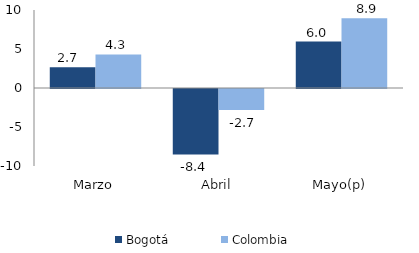
| Category | Bogotá | Colombia |
|---|---|---|
| Marzo | 2.659 | 4.297 |
| Abril | -8.397 | -2.703 |
| Mayo(p) | 5.951 | 8.927 |